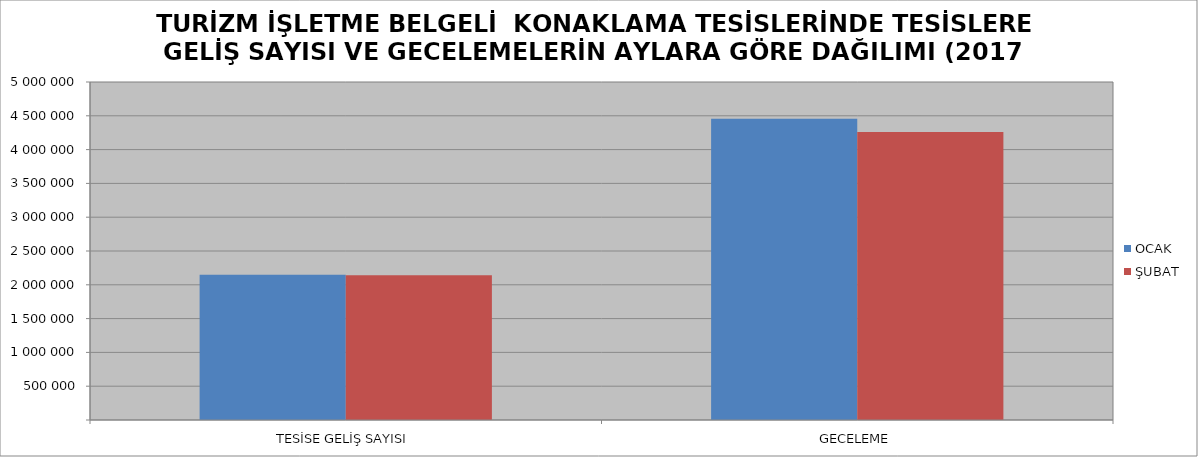
| Category | OCAK | ŞUBAT |
|---|---|---|
| TESİSE GELİŞ SAYISI | 2146994 | 2141043 |
| GECELEME | 4457352 | 4260377 |